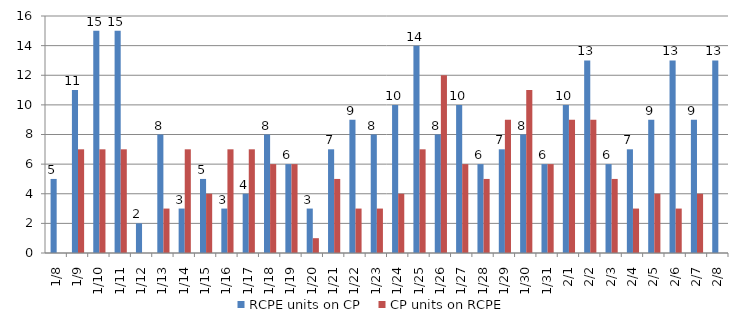
| Category | RCPE units on CP | CP units on RCPE |
|---|---|---|
| 2015-01-08 | 5 | 0 |
| 2015-01-09 | 11 | 7 |
| 2015-01-10 | 15 | 7 |
| 2015-01-11 | 15 | 7 |
| 2015-01-12 | 2 | 0 |
| 2015-01-13 | 8 | 3 |
| 2015-01-14 | 3 | 7 |
| 2015-01-15 | 5 | 4 |
| 2015-01-16 | 3 | 7 |
| 2015-01-17 | 4 | 7 |
| 2015-01-18 | 8 | 6 |
| 2015-01-19 | 6 | 6 |
| 2015-01-20 | 3 | 1 |
| 2015-01-21 | 7 | 5 |
| 2015-01-22 | 9 | 3 |
| 2015-01-23 | 8 | 3 |
| 2015-01-24 | 10 | 4 |
| 2015-01-25 | 14 | 7 |
| 2015-01-26 | 8 | 12 |
| 2015-01-27 | 10 | 6 |
| 2015-01-28 | 6 | 5 |
| 2015-01-29 | 7 | 9 |
| 2015-01-30 | 8 | 11 |
| 2015-01-31 | 6 | 6 |
| 2015-02-01 | 10 | 9 |
| 2015-02-02 | 13 | 9 |
| 2015-02-03 | 6 | 5 |
| 2015-02-04 | 7 | 3 |
| 2015-02-05 | 9 | 4 |
| 2015-02-06 | 13 | 3 |
| 2015-02-07 | 9 | 4 |
| 2015-02-08 | 13 | 0 |